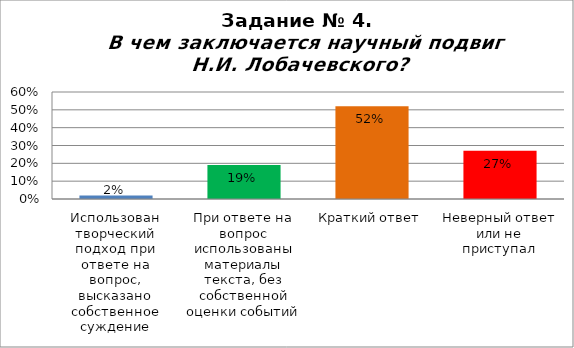
| Category | В чем заключается научный подвиг Н.И. Лобачевского? |
|---|---|
| Использован творческий подход при ответе на вопрос, высказано собственное суждение | 0.02 |
| При ответе на вопрос использованы материалы текста, без собственной оценки событий | 0.19 |
| Краткий ответ | 0.52 |
| Неверный ответ или не приступал | 0.27 |